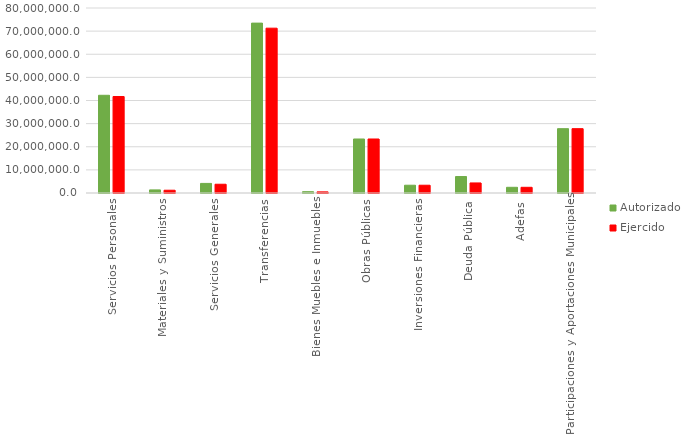
| Category | Autorizado | Ejercido |
|---|---|---|
| Servicios Personales | 42252609.1 | 41721157.7 |
| Materiales y Suministros | 1335082.1 | 1198653.4 |
| Servicios Generales | 4142916.1 | 3788555.3 |
| Transferencias | 73461592.3 | 71274445.3 |
| Bienes Muebles e Inmuebles | 564590 | 484669.3 |
| Obras Públicas | 23353348.7 | 23353348.7 |
| Inversiones Financieras | 3358920.3 | 3358920.3 |
| Deuda Pública | 7116098.9 | 4348052.3 |
| Adefas | 2460661.3 | 2460659.3 |
| Participaciones y Aportaciones Municipales | 27814900.8 | 27814900.8 |